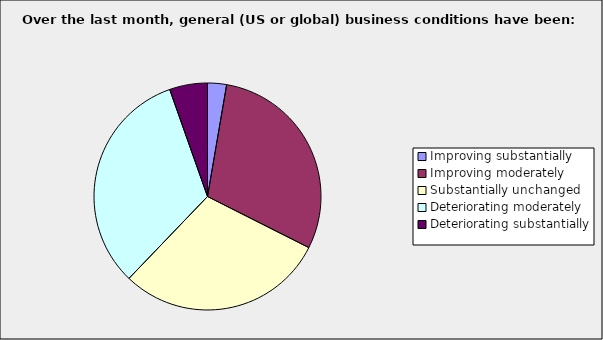
| Category | Series 0 |
|---|---|
| Improving substantially | 0.027 |
| Improving moderately | 0.297 |
| Substantially unchanged | 0.297 |
| Deteriorating moderately | 0.324 |
| Deteriorating substantially | 0.054 |